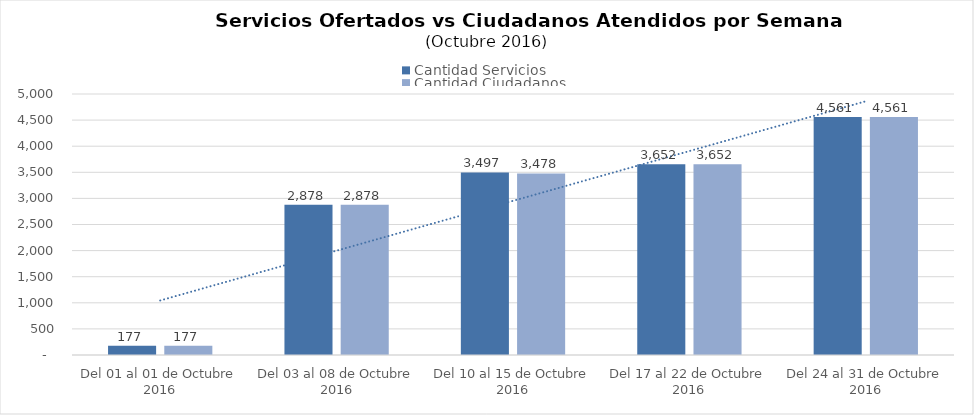
| Category | Cantidad Servicios | Cantidad Ciudadanos |
|---|---|---|
| Del 01 al 01 de Octubre 2016 | 177 | 177 |
| Del 03 al 08 de Octubre 2016 | 2878 | 2878 |
| Del 10 al 15 de Octubre 2016 | 3497 | 3478 |
| Del 17 al 22 de Octubre 2016 | 3652 | 3652 |
| Del 24 al 31 de Octubre 2016 | 4561 | 4561 |